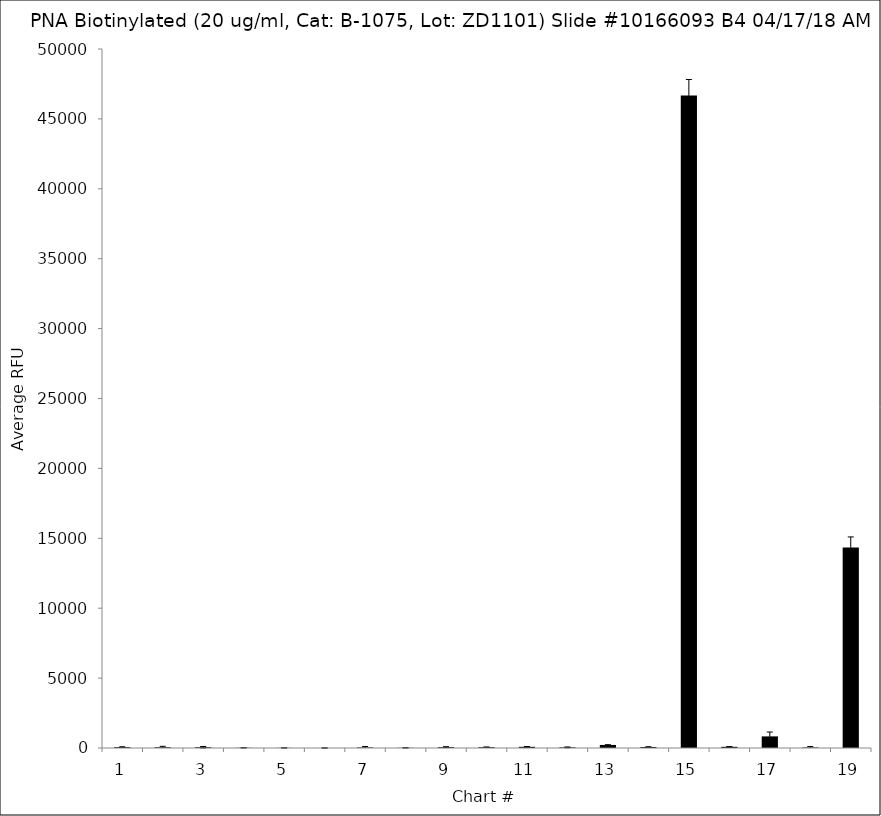
| Category | Series 0 |
|---|---|
| 1.0 | 63 |
| 2.0 | 54.5 |
| 3.0 | 56.75 |
| 4.0 | 14 |
| 5.0 | 8.5 |
| 6.0 | 2.25 |
| 7.0 | 41.25 |
| 8.0 | 12.75 |
| 9.0 | 61 |
| 10.0 | 58.75 |
| 11.0 | 85.5 |
| 12.0 | 46.25 |
| 13.0 | 218.5 |
| 14.0 | 72.75 |
| 15.0 | 46673.25 |
| 16.0 | 85.5 |
| 17.0 | 830.25 |
| 18.0 | 37.5 |
| 19.0 | 14350.75 |